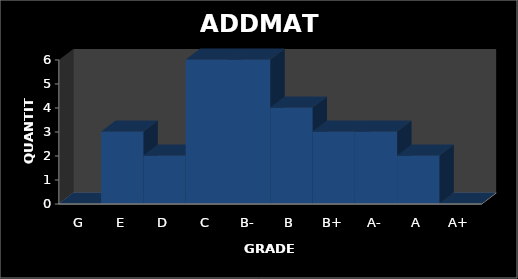
| Category | QUANTITY |
|---|---|
| G | 0 |
| E | 3 |
| D | 2 |
| C | 6 |
| B- | 6 |
| B | 4 |
| B+ | 3 |
| A- | 3 |
| A | 2 |
| A+ | 0 |